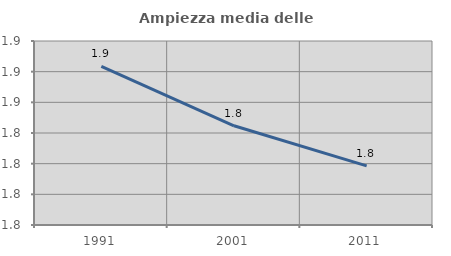
| Category | Ampiezza media delle famiglie |
|---|---|
| 1991.0 | 1.883 |
| 2001.0 | 1.845 |
| 2011.0 | 1.819 |